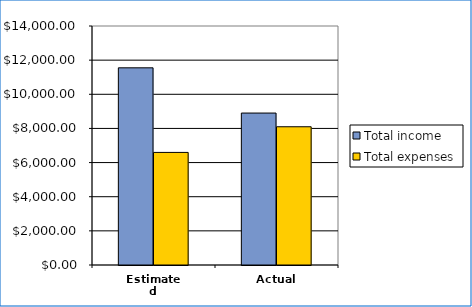
| Category | Total income | Total expenses |
|---|---|---|
| Estimated | 11550 | 6595 |
| Actual | 8901 | 8098 |